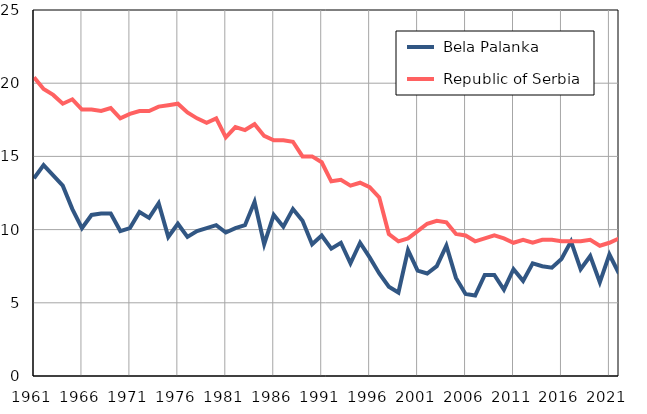
| Category |  Bela Palanka |  Republic of Serbia |
|---|---|---|
| 1961.0 | 13.5 | 20.4 |
| 1962.0 | 14.4 | 19.6 |
| 1963.0 | 13.7 | 19.2 |
| 1964.0 | 13 | 18.6 |
| 1965.0 | 11.4 | 18.9 |
| 1966.0 | 10.1 | 18.2 |
| 1967.0 | 11 | 18.2 |
| 1968.0 | 11.1 | 18.1 |
| 1969.0 | 11.1 | 18.3 |
| 1970.0 | 9.9 | 17.6 |
| 1971.0 | 10.1 | 17.9 |
| 1972.0 | 11.2 | 18.1 |
| 1973.0 | 10.8 | 18.1 |
| 1974.0 | 11.8 | 18.4 |
| 1975.0 | 9.5 | 18.5 |
| 1976.0 | 10.4 | 18.6 |
| 1977.0 | 9.5 | 18 |
| 1978.0 | 9.9 | 17.6 |
| 1979.0 | 10.1 | 17.3 |
| 1980.0 | 10.3 | 17.6 |
| 1981.0 | 9.8 | 16.3 |
| 1982.0 | 10.1 | 17 |
| 1983.0 | 10.3 | 16.8 |
| 1984.0 | 11.9 | 17.2 |
| 1985.0 | 9 | 16.4 |
| 1986.0 | 11 | 16.1 |
| 1987.0 | 10.2 | 16.1 |
| 1988.0 | 11.4 | 16 |
| 1989.0 | 10.6 | 15 |
| 1990.0 | 9 | 15 |
| 1991.0 | 9.6 | 14.6 |
| 1992.0 | 8.7 | 13.3 |
| 1993.0 | 9.1 | 13.4 |
| 1994.0 | 7.7 | 13 |
| 1995.0 | 9.1 | 13.2 |
| 1996.0 | 8.1 | 12.9 |
| 1997.0 | 7 | 12.2 |
| 1998.0 | 6.1 | 9.7 |
| 1999.0 | 5.7 | 9.2 |
| 2000.0 | 8.6 | 9.4 |
| 2001.0 | 7.2 | 9.9 |
| 2002.0 | 7 | 10.4 |
| 2003.0 | 7.5 | 10.6 |
| 2004.0 | 8.9 | 10.5 |
| 2005.0 | 6.7 | 9.7 |
| 2006.0 | 5.6 | 9.6 |
| 2007.0 | 5.5 | 9.2 |
| 2008.0 | 6.9 | 9.4 |
| 2009.0 | 6.9 | 9.6 |
| 2010.0 | 5.9 | 9.4 |
| 2011.0 | 7.3 | 9.1 |
| 2012.0 | 6.5 | 9.3 |
| 2013.0 | 7.7 | 9.1 |
| 2014.0 | 7.5 | 9.3 |
| 2015.0 | 7.4 | 9.3 |
| 2016.0 | 8 | 9.2 |
| 2017.0 | 9.2 | 9.2 |
| 2018.0 | 7.3 | 9.2 |
| 2019.0 | 8.2 | 9.3 |
| 2020.0 | 6.4 | 8.9 |
| 2021.0 | 8.3 | 9.1 |
| 2022.0 | 7 | 9.4 |